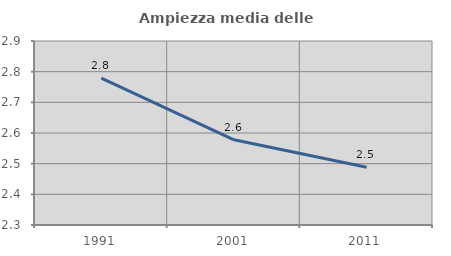
| Category | Ampiezza media delle famiglie |
|---|---|
| 1991.0 | 2.779 |
| 2001.0 | 2.578 |
| 2011.0 | 2.489 |